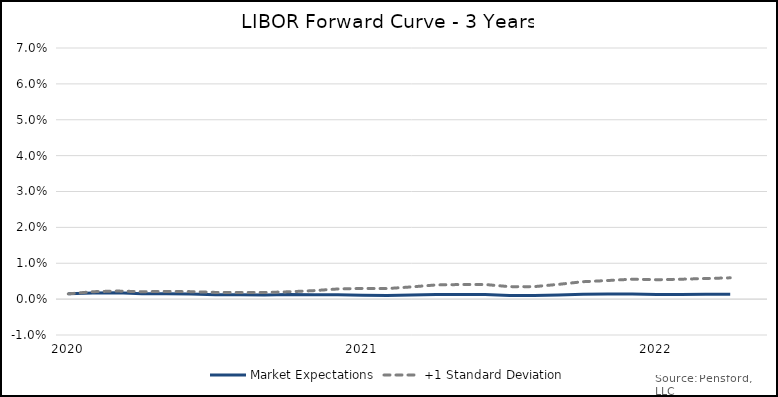
| Category | Market Expectations | +1 Standard Deviation |
|---|---|---|
| 2020-09-30 | 0.001 | 0.001 |
| 2020-10-30 | 0.002 | 0.002 |
| 2020-11-30 | 0.002 | 0.002 |
| 2020-12-30 | 0.002 | 0.002 |
| 2021-01-30 | 0.002 | 0.002 |
| 2021-02-28 | 0.001 | 0.002 |
| 2021-03-28 | 0.001 | 0.002 |
| 2021-04-28 | 0.001 | 0.002 |
| 2021-05-28 | 0.001 | 0.002 |
| 2021-06-28 | 0.001 | 0.002 |
| 2021-07-28 | 0.001 | 0.002 |
| 2021-08-28 | 0.001 | 0.003 |
| 2021-09-28 | 0.001 | 0.003 |
| 2021-10-28 | 0.001 | 0.003 |
| 2021-11-28 | 0.001 | 0.003 |
| 2021-12-28 | 0.001 | 0.004 |
| 2022-01-28 | 0.001 | 0.004 |
| 2022-02-28 | 0.001 | 0.004 |
| 2022-03-28 | 0.001 | 0.003 |
| 2022-04-28 | 0.001 | 0.003 |
| 2022-05-28 | 0.001 | 0.004 |
| 2022-06-28 | 0.001 | 0.005 |
| 2022-07-28 | 0.001 | 0.005 |
| 2022-08-28 | 0.001 | 0.006 |
| 2022-09-28 | 0.001 | 0.005 |
| 2022-10-28 | 0.001 | 0.006 |
| 2022-11-28 | 0.001 | 0.006 |
| 2022-12-28 | 0.001 | 0.006 |
| 2023-01-28 | 0.001 | 0.006 |
| 2023-02-28 | 0.001 | 0.006 |
| 2023-03-28 | 0.001 | 0.007 |
| 2023-04-28 | 0.001 | 0.007 |
| 2023-05-28 | 0.001 | 0.007 |
| 2023-06-28 | 0.002 | 0.007 |
| 2023-07-28 | 0.002 | 0.007 |
| 2023-08-28 | 0.002 | 0.006 |
| 2023-09-28 | 0.002 | 0.008 |
| 2023-10-28 | 0.002 | 0.008 |
| 2023-11-28 | 0.002 | 0.008 |
| 2023-12-28 | 0.002 | 0.009 |
| 2024-01-28 | 0.002 | 0.009 |
| 2024-02-28 | 0.002 | 0.009 |
| 2024-03-28 | 0.003 | 0.009 |
| 2024-04-28 | 0.003 | 0.01 |
| 2024-05-28 | 0.003 | 0.01 |
| 2024-06-28 | 0.003 | 0.01 |
| 2024-07-28 | 0.003 | 0.011 |
| 2024-08-28 | 0.003 | 0.011 |
| 2024-09-28 | 0.004 | 0.014 |
| 2024-10-28 | 0.004 | 0.015 |
| 2024-11-28 | 0.004 | 0.015 |
| 2024-12-28 | 0.004 | 0.015 |
| 2025-01-28 | 0.004 | 0.016 |
| 2025-02-28 | 0.004 | 0.016 |
| 2025-03-28 | 0.004 | 0.017 |
| 2025-04-28 | 0.004 | 0.017 |
| 2025-05-28 | 0.005 | 0.018 |
| 2025-06-28 | 0.005 | 0.018 |
| 2025-07-28 | 0.005 | 0.018 |
| 2025-08-28 | 0.005 | 0.017 |
| 2025-09-28 | 0.006 | 0.017 |
| 2025-10-28 | 0.006 | 0.017 |
| 2025-11-28 | 0.006 | 0.018 |
| 2025-12-28 | 0.006 | 0.018 |
| 2026-01-28 | 0.006 | 0.019 |
| 2026-02-28 | 0.006 | 0.019 |
| 2026-03-28 | 0.006 | 0.02 |
| 2026-04-28 | 0.006 | 0.02 |
| 2026-05-28 | 0.007 | 0.02 |
| 2026-06-28 | 0.007 | 0.021 |
| 2026-07-28 | 0.007 | 0.022 |
| 2026-08-28 | 0.007 | 0.023 |
| 2026-09-28 | 0.007 | 0.025 |
| 2026-10-28 | 0.007 | 0.026 |
| 2026-11-28 | 0.008 | 0.026 |
| 2026-12-28 | 0.008 | 0.027 |
| 2027-01-28 | 0.008 | 0.027 |
| 2027-02-28 | 0.008 | 0.028 |
| 2027-03-28 | 0.008 | 0.028 |
| 2027-04-28 | 0.008 | 0.029 |
| 2027-05-28 | 0.008 | 0.029 |
| 2027-06-28 | 0.008 | 0.03 |
| 2027-07-28 | 0.009 | 0.031 |
| 2027-08-28 | 0.009 | 0.031 |
| 2027-09-28 | 0.009 | 0.032 |
| 2027-10-28 | 0.009 | 0.032 |
| 2027-11-28 | 0.009 | 0.033 |
| 2027-12-28 | 0.009 | 0.033 |
| 2028-01-28 | 0.009 | 0.034 |
| 2028-02-28 | 0.009 | 0.034 |
| 2028-03-28 | 0.009 | 0.035 |
| 2028-04-28 | 0.009 | 0.035 |
| 2028-05-28 | 0.01 | 0.036 |
| 2028-06-28 | 0.01 | 0.036 |
| 2028-07-28 | 0.01 | 0.036 |
| 2028-08-28 | 0.01 | 0.036 |
| 2028-09-28 | 0.01 | 0.036 |
| 2028-10-28 | 0.01 | 0.036 |
| 2028-11-28 | 0.01 | 0.036 |
| 2028-12-28 | 0.01 | 0.037 |
| 2029-01-28 | 0.01 | 0.037 |
| 2029-02-28 | 0.01 | 0.038 |
| 2029-03-28 | 0.01 | 0.038 |
| 2029-04-28 | 0.011 | 0.039 |
| 2029-05-28 | 0.011 | 0.039 |
| 2029-06-28 | 0.011 | 0.04 |
| 2029-07-28 | 0.011 | 0.036 |
| 2029-08-28 | 0.011 | 0.031 |
| 2029-09-28 | 0.011 | 0.027 |
| 2029-10-28 | 0.011 | 0.026 |
| 2029-11-28 | 0.011 | 0.027 |
| 2029-12-28 | 0.011 | 0.027 |
| 2030-01-28 | 0.011 | 0.027 |
| 2030-02-28 | 0.011 | 0.027 |
| 2030-03-28 | 0.011 | 0.028 |
| 2030-04-28 | 0.011 | 0.028 |
| 2030-05-28 | 0.012 | 0.028 |
| 2030-06-28 | 0.012 | 0.029 |
| 2030-07-28 | 0.012 | 0.032 |
| 2030-08-28 | 0.012 | 0.035 |